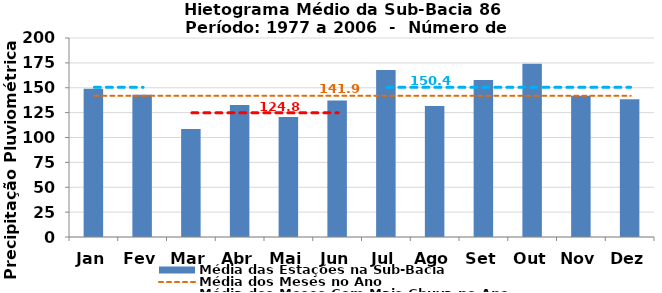
| Category | Média das Estações na Sub-Bacia |
|---|---|
| Jan | 148.895 |
| Fev | 143.053 |
| Mar | 108.575 |
| Abr | 132.653 |
| Mai | 120.726 |
| Jun | 137.123 |
| Jul | 167.838 |
| Ago | 131.661 |
| Set | 157.734 |
| Out | 174.008 |
| Nov | 142.033 |
| Dez | 138.351 |